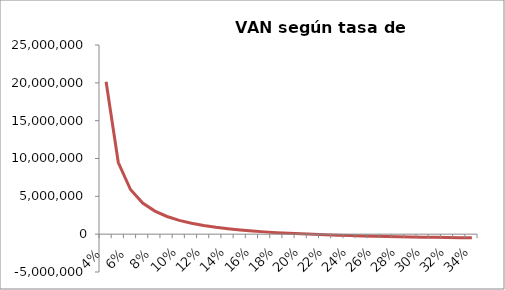
| Category | Series 1 |
|---|---|
| 0.04 | 20137598.185 |
| 0.05 | 9463859.684 |
| 0.060000000000000005 | 5902830.489 |
| 0.07 | 4120629.903 |
| 0.08 | 3050420.514 |
| 0.09 | 2336544.389 |
| 0.09999999999999999 | 1826541.99 |
| 0.10999999999999999 | 1444156.485 |
| 0.11999999999999998 | 1147001.529 |
| 0.12999999999999998 | 909628.114 |
| 0.13999999999999999 | 715827.476 |
| 0.15 | 554782.377 |
| 0.16 | 418994.578 |
| 0.17 | 303100.431 |
| 0.18000000000000002 | 203160.13 |
| 0.19000000000000003 | 116213.422 |
| 0.20000000000000004 | 39992.052 |
| 0.21000000000000005 | -27271.985 |
| 0.22000000000000006 | -86977.698 |
| 0.23000000000000007 | -140247.014 |
| 0.24000000000000007 | -187990.455 |
| 0.25000000000000006 | -230954.95 |
| 0.26000000000000006 | -269759.182 |
| 0.2700000000000001 | -304920.127 |
| 0.2800000000000001 | -336873.242 |
| 0.2900000000000001 | -365988.007 |
| 0.3000000000000001 | -392580.03 |
| 0.3100000000000001 | -416920.562 |
| 0.3200000000000001 | -439244.066 |
| 0.3300000000000001 | -459754.268 |
| 0.34000000000000014 | -478629.052 |